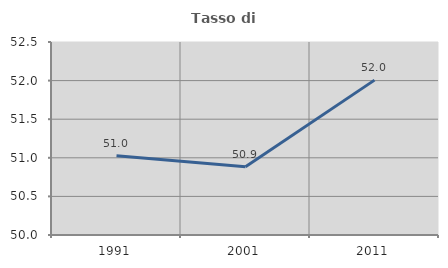
| Category | Tasso di occupazione   |
|---|---|
| 1991.0 | 51.027 |
| 2001.0 | 50.885 |
| 2011.0 | 52.006 |